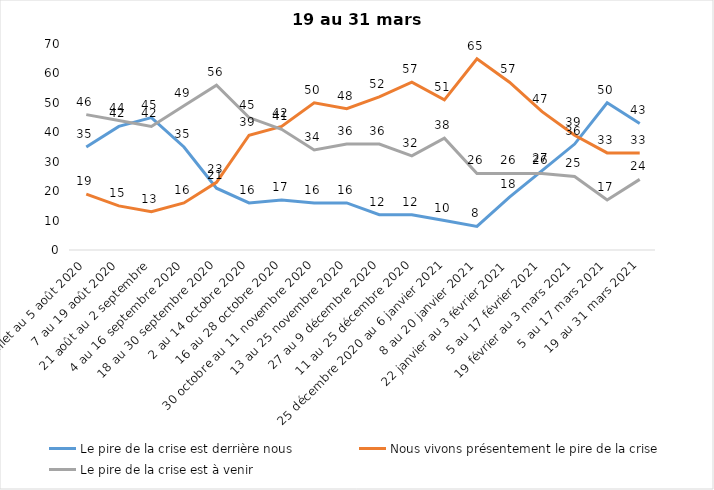
| Category | Le pire de la crise est derrière nous | Nous vivons présentement le pire de la crise | Le pire de la crise est à venir |
|---|---|---|---|
| 24 juillet au 5 août 2020 | 35 | 19 | 46 |
| 7 au 19 août 2020 | 42 | 15 | 44 |
| 21 août au 2 septembre | 45 | 13 | 42 |
| 4 au 16 septembre 2020 | 35 | 16 | 49 |
| 18 au 30 septembre 2020 | 21 | 23 | 56 |
| 2 au 14 octobre 2020 | 16 | 39 | 45 |
| 16 au 28 octobre 2020 | 17 | 42 | 41 |
| 30 octobre au 11 novembre 2020 | 16 | 50 | 34 |
| 13 au 25 novembre 2020 | 16 | 48 | 36 |
| 27 au 9 décembre 2020 | 12 | 52 | 36 |
| 11 au 25 décembre 2020 | 12 | 57 | 32 |
| 25 décembre 2020 au 6 janvier 2021 | 10 | 51 | 38 |
| 8 au 20 janvier 2021 | 8 | 65 | 26 |
| 22 janvier au 3 février 2021 | 18 | 57 | 26 |
| 5 au 17 février 2021 | 27 | 47 | 26 |
| 19 février au 3 mars 2021 | 36 | 39 | 25 |
| 5 au 17 mars 2021 | 50 | 33 | 17 |
| 19 au 31 mars 2021 | 43 | 33 | 24 |